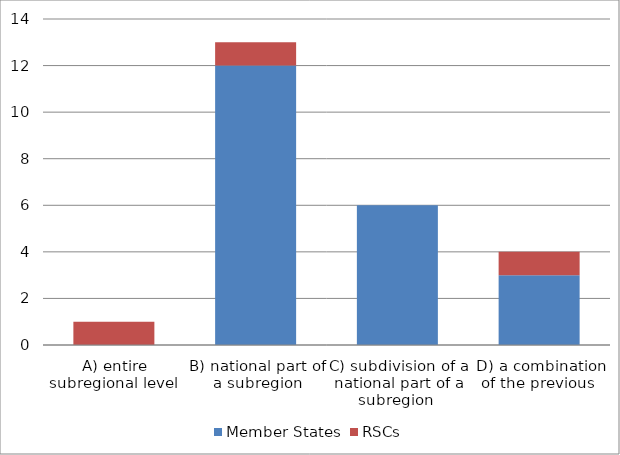
| Category | Member States | RSCs |
|---|---|---|
| A) entire subregional level  | 0 | 1 |
| B) national part of a subregion | 12 | 1 |
| C) subdivision of a national part of a subregion  | 6 | 0 |
| D) a combination of the previous  | 3 | 1 |